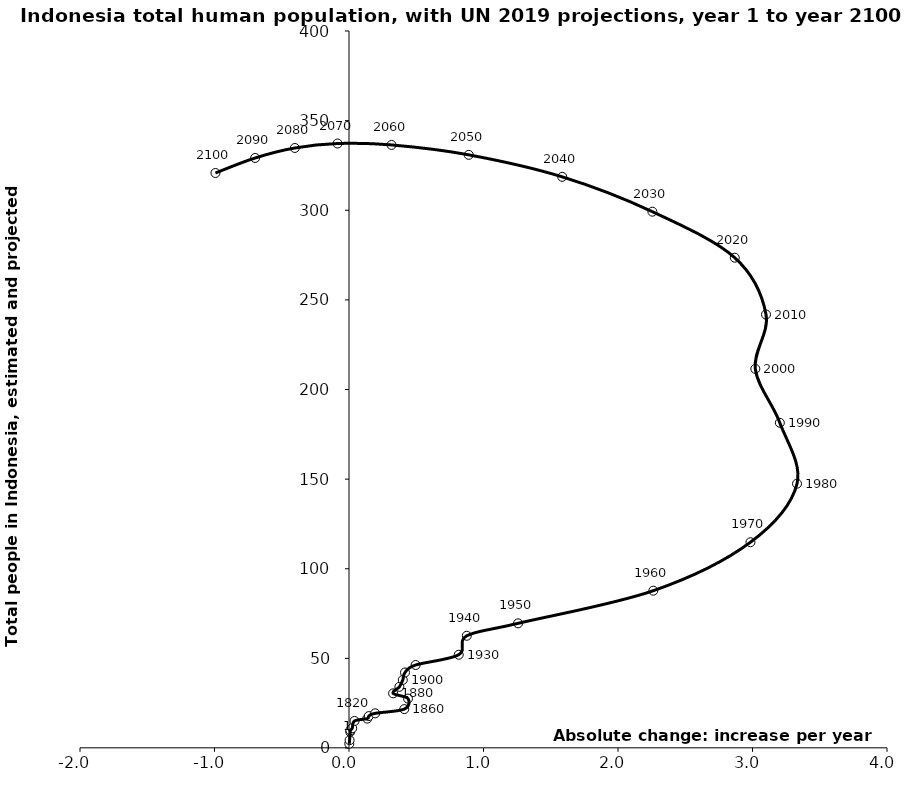
| Category | Series 0 |
|---|---|
| 0.0020203355251053124 | 2.357 |
| 0.0044364717167922965 | 4.377 |
| 0.009119570078600368 | 9.007 |
| 0.010101677625526566 | 9.849 |
| 0.02382694945990678 | 11.028 |
| 0.04126794327402614 | 15.091 |
| 0.13578338341645288 | 16.392 |
| 0.14748449333268782 | 17.807 |
| 0.19470983623202454 | 19.342 |
| 0.41105409871205156 | 21.701 |
| 0.43874953153537016 | 27.563 |
| 0.32784152927177634 | 30.476 |
| 0.37447760764295773 | 34.12 |
| 0.3999422533239727 | 37.965 |
| 0.41639956978889253 | 42.119 |
| 0.49544519720863817 | 46.293 |
| 0.8158367392315892 | 52.028 |
| 0.8757733598097129 | 62.61 |
| 1.2570435038493195 | 69.543 |
| 2.262493099999997 | 87.751 |
| 2.9848384 | 114.793 |
| 3.3310112000000016 | 147.448 |
| 3.203299350000006 | 181.413 |
| 3.0210406499999976 | 211.514 |
| 3.100489599999996 | 241.834 |
| 2.868210749999996 | 273.524 |
| 2.2557121499999937 | 299.198 |
| 1.5853116999999997 | 318.638 |
| 0.8903090500000019 | 330.905 |
| 0.3160063500000092 | 336.444 |
| -0.0851991499999997 | 337.225 |
| -0.40267330000000356 | 334.74 |
| -0.697881600000008 | 329.171 |
| -0.9930899000000124 | 320.782 |